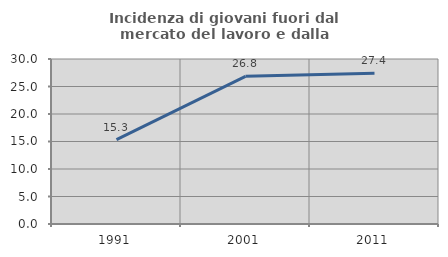
| Category | Incidenza di giovani fuori dal mercato del lavoro e dalla formazione  |
|---|---|
| 1991.0 | 15.34 |
| 2001.0 | 26.844 |
| 2011.0 | 27.425 |